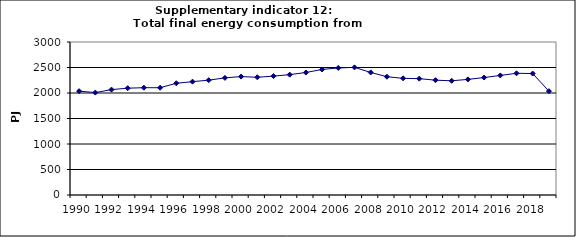
| Category | Total final energy consumption from transport, PJ |
|---|---|
| 1990 | 2036.25 |
| 1991 | 2008.534 |
| 1992 | 2066.395 |
| 1993 | 2094.405 |
| 1994 | 2103.993 |
| 1995 | 2103.365 |
| 1996 | 2190.592 |
| 1997 | 2222.459 |
| 1998 | 2251.326 |
| 1999 | 2296.589 |
| 2000 | 2322.046 |
| 2001 | 2308.488 |
| 2002 | 2331.413 |
| 2003 | 2359.923 |
| 2004 | 2402.141 |
| 2005 | 2461.552 |
| 2006 | 2491.207 |
| 2007 | 2502.489 |
| 2008 | 2402.943 |
| 2009 | 2319.216 |
| 2010 | 2287.498 |
| 2011 | 2281.518 |
| 2012 | 2251.513 |
| 2013 | 2239.507 |
| 2014 | 2266.977 |
| 2015 | 2303.269 |
| 2016 | 2344.63 |
| 2017 | 2386.584 |
| 2018 | 2381.602 |
| 2019 | 2036.25 |